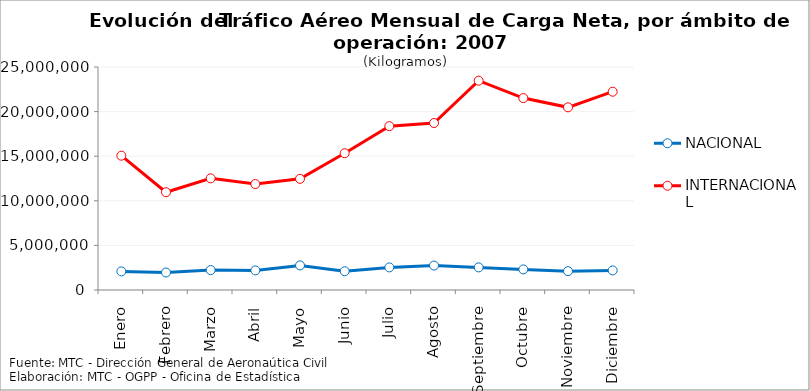
| Category | NACIONAL | INTERNACIONAL |
|---|---|---|
| Enero | 2086670 | 15056036 |
| Febrero | 1959975 | 10963388 |
| Marzo | 2232827 | 12514959 |
| Abril | 2196710 | 11876724 |
| Mayo | 2757847 | 12463005 |
| Junio | 2104533 | 15335445 |
| Julio | 2533543 | 18370834 |
| Agosto | 2741191 | 18718225 |
| Septiembre | 2533115 | 23467141 |
| Octubre | 2309211 | 21516542 |
| Noviembre | 2111750 | 20479207 |
| Diciembre | 2196940 | 22230283 |